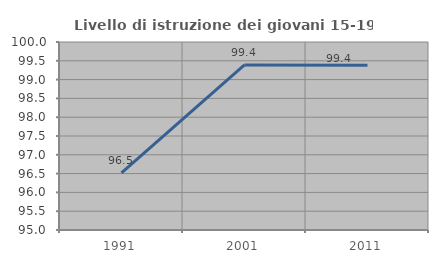
| Category | Livello di istruzione dei giovani 15-19 anni |
|---|---|
| 1991.0 | 96.518 |
| 2001.0 | 99.39 |
| 2011.0 | 99.385 |